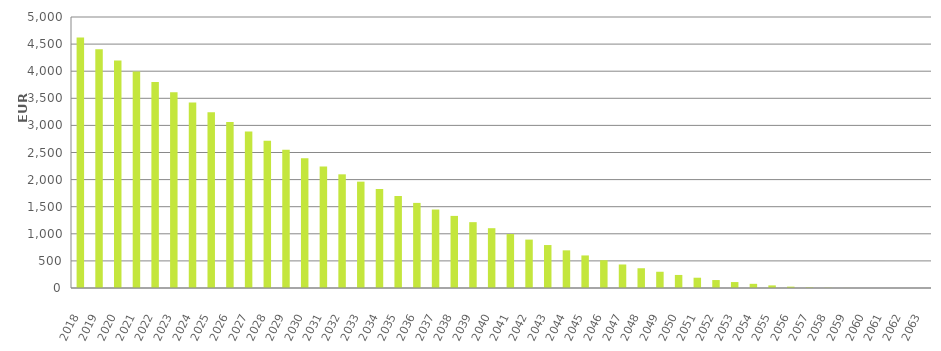
| Category | EUR Millions |
|---|---|
| 2018.0 | 4620000000 |
| 2019.0 | 4405103066.523 |
| 2020.0 | 4195897232.973 |
| 2021.0 | 3993880561.827 |
| 2022.0 | 3799117797.684 |
| 2023.0 | 3609821280.773 |
| 2024.0 | 3424485344.911 |
| 2025.0 | 3242565935.77 |
| 2026.0 | 3063562910.519 |
| 2027.0 | 2887530342.548 |
| 2028.0 | 2715577010.903 |
| 2029.0 | 2550453555.165 |
| 2030.0 | 2391915215.166 |
| 2031.0 | 2240106709.61 |
| 2032.0 | 2097298644.486 |
| 2033.0 | 1962185511.132 |
| 2034.0 | 1827920769.482 |
| 2035.0 | 1696916641.86 |
| 2036.0 | 1570024862.05 |
| 2037.0 | 1447776723.363 |
| 2038.0 | 1330180250.643 |
| 2039.0 | 1214763470.811 |
| 2040.0 | 1103360027.438 |
| 2041.0 | 996255814.444 |
| 2042.0 | 892933070.599 |
| 2043.0 | 792518567.526 |
| 2044.0 | 694644027.214 |
| 2045.0 | 600758070.12 |
| 2046.0 | 512754646.728 |
| 2047.0 | 433936324.152 |
| 2048.0 | 364531626.073 |
| 2049.0 | 299710689.09 |
| 2050.0 | 240692534.893 |
| 2051.0 | 189698557.843 |
| 2052.0 | 146839797.111 |
| 2053.0 | 109606310.448 |
| 2054.0 | 76828532.515 |
| 2055.0 | 48138714.862 |
| 2056.0 | 24893506.331 |
| 2057.0 | 9926269.152 |
| 2058.0 | 4372628.477 |
| 2059.0 | 1330272.949 |
| 2060.0 | 252224.374 |
| 2061.0 | 61604.6 |
| 2062.0 | 19615.738 |
| 2063.0 | 0 |